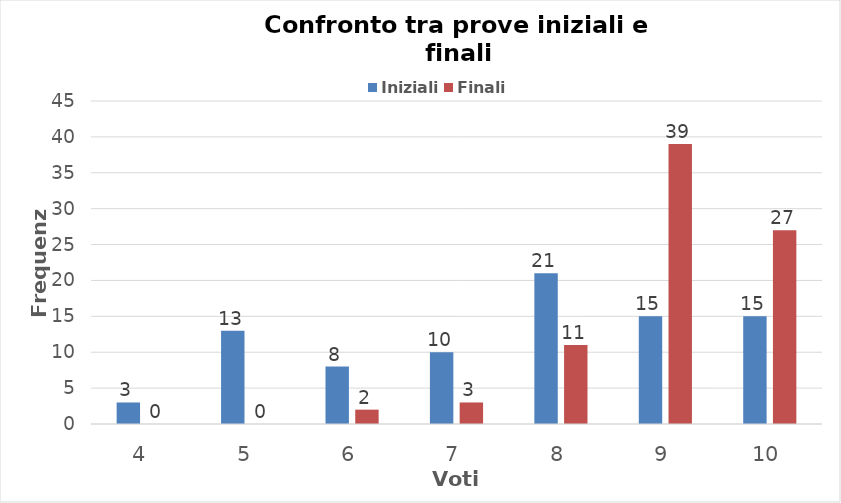
| Category | Iniziali | Finali |
|---|---|---|
| 4.0 | 3 | 0 |
| 5.0 | 13 | 0 |
| 6.0 | 8 | 2 |
| 7.0 | 10 | 3 |
| 8.0 | 21 | 11 |
| 9.0 | 15 | 39 |
| 10.0 | 15 | 27 |